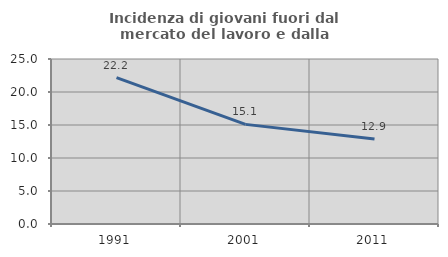
| Category | Incidenza di giovani fuori dal mercato del lavoro e dalla formazione  |
|---|---|
| 1991.0 | 22.165 |
| 2001.0 | 15.094 |
| 2011.0 | 12.883 |